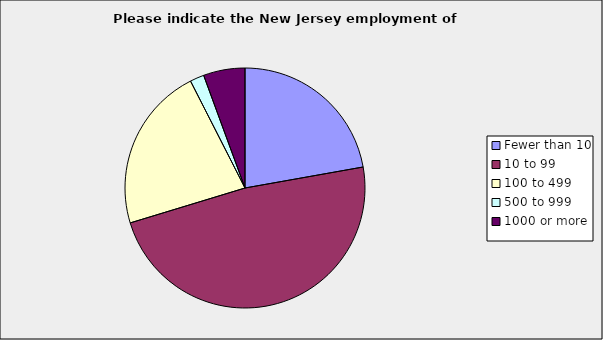
| Category | Series 0 |
|---|---|
| Fewer than 10 | 0.222 |
| 10 to 99 | 0.481 |
| 100 to 499 | 0.222 |
| 500 to 999 | 0.019 |
| 1000 or more | 0.056 |